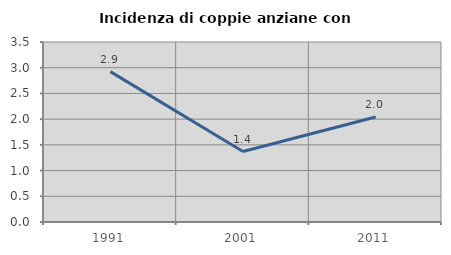
| Category | Incidenza di coppie anziane con figli |
|---|---|
| 1991.0 | 2.924 |
| 2001.0 | 1.37 |
| 2011.0 | 2.041 |